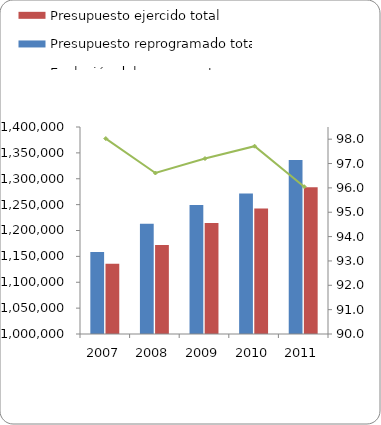
| Category | Presupuesto reprogramado total | Presupuesto ejercido total |
|---|---|---|
| 2007 | 1158493 | 1135618 |
| 2008 | 1213247 | 1172131 |
| 2009 | 1249220 | 1214312 |
| 2010 | 1271711.48 | 1242620.47 |
| 2011 | 1336369.4 | 1283563.8 |